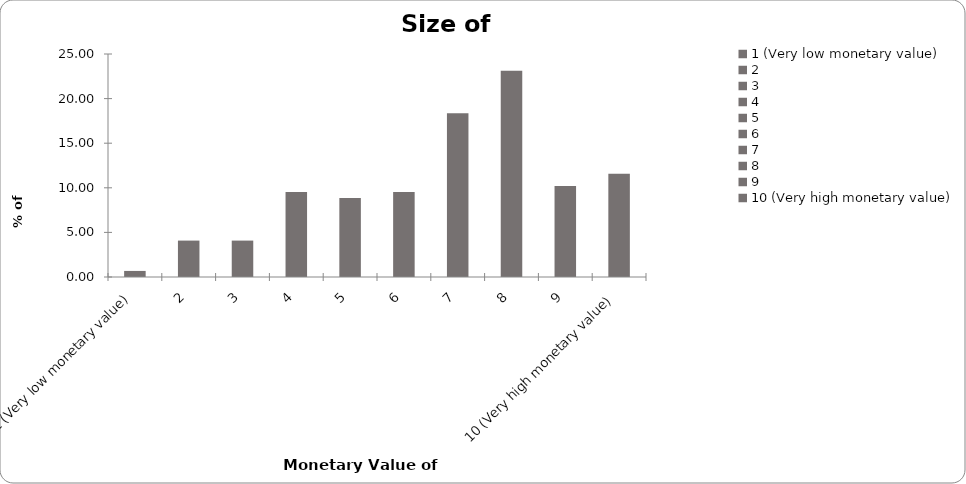
| Category | Series 1 |
|---|---|
| 1 (Very low monetary value) | 0.68 |
| 2 | 4.082 |
| 3 | 4.082 |
| 4 | 9.524 |
| 5 | 8.844 |
| 6 | 9.524 |
| 7 | 18.367 |
| 8 | 23.129 |
| 9 | 10.204 |
| 10 (Very high monetary value) | 11.565 |